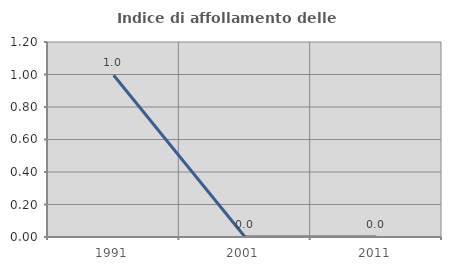
| Category | Indice di affollamento delle abitazioni  |
|---|---|
| 1991.0 | 0.995 |
| 2001.0 | 0 |
| 2011.0 | 0 |